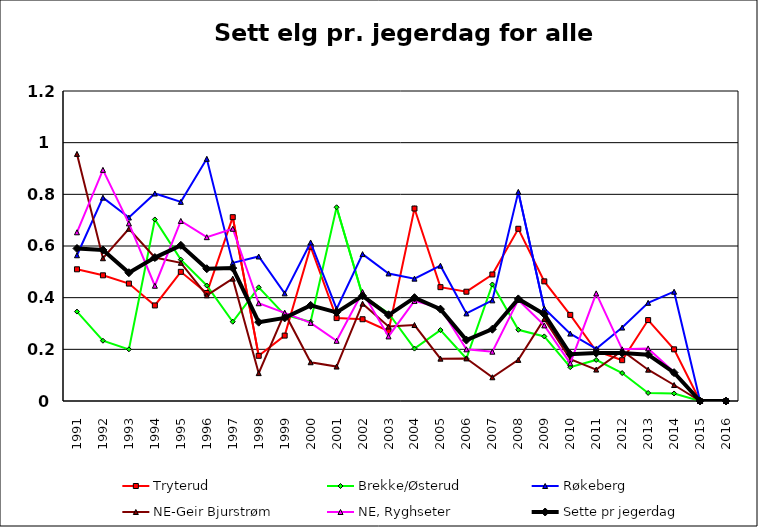
| Category | Tryterud | Brekke/Østerud | Røkeberg | NE-Geir Bjurstrøm | NE, Ryghseter | Sette pr |
|---|---|---|---|---|---|---|
| 1991.0 | 0.51 | 0.346 | 0.564 | 0.957 | 0.653 | 0.59 |
| 1992.0 | 0.486 | 0.233 | 0.787 | 0.553 | 0.895 | 0.585 |
| 1993.0 | 0.455 | 0.2 | 0.71 | 0.667 | 0.688 | 0.497 |
| 1994.0 | 0.37 | 0.703 | 0.803 | 0.556 | 0.446 | 0.555 |
| 1995.0 | 0.5 | 0.547 | 0.771 | 0.535 | 0.697 | 0.603 |
| 1996.0 | 0.418 | 0.447 | 0.938 | 0.409 | 0.634 | 0.512 |
| 1997.0 | 0.712 | 0.307 | 0.535 | 0.474 | 0.667 | 0.515 |
| 1998.0 | 0.175 | 0.44 | 0.559 | 0.108 | 0.378 | 0.305 |
| 1999.0 | 0.253 | 0.333 | 0.417 | 0.341 | 0.341 | 0.322 |
| 2000.0 | 0.597 | 0.307 | 0.614 | 0.15 | 0.302 | 0.37 |
| 2001.0 | 0.321 | 0.75 | 0.356 | 0.133 | 0.233 | 0.343 |
| 2002.0 | 0.316 | 0.408 | 0.569 | 0.377 | 0.422 | 0.407 |
| 2003.0 | 0.271 | 0.34 | 0.494 | 0.288 | 0.25 | 0.332 |
| 2004.0 | 0.745 | 0.203 | 0.474 | 0.294 | 0.388 | 0.4 |
| 2005.0 | 0.441 | 0.275 | 0.524 | 0.164 | 0.36 | 0.356 |
| 2006.0 | 0.423 | 0.165 | 0.339 | 0.165 | 0.2 | 0.236 |
| 2007.0 | 0.49 | 0.451 | 0.39 | 0.092 | 0.191 | 0.278 |
| 2008.0 | 0.667 | 0.276 | 0.81 | 0.159 | 0.391 | 0.395 |
| 2009.0 | 0.463 | 0.25 | 0.358 | 0.318 | 0.293 | 0.336 |
| 2010.0 | 0.333 | 0.131 | 0.261 | 0.161 | 0.146 | 0.181 |
| 2011.0 | 0.194 | 0.159 | 0.202 | 0.122 | 0.417 | 0.186 |
| 2012.0 | 0.158 | 0.108 | 0.284 | 0.194 | 0.2 | 0.186 |
| 2013.0 | 0.313 | 0.031 | 0.38 | 0.121 | 0.204 | 0.179 |
| 2014.0 | 0.2 | 0.029 | 0.423 | 0.062 | 0.111 | 0.11 |
| 2015.0 | 0 | 0 | 0 | 0 | 0 | 0 |
| 2016.0 | 0 | 0 | 0 | 0 | 0 | 0 |